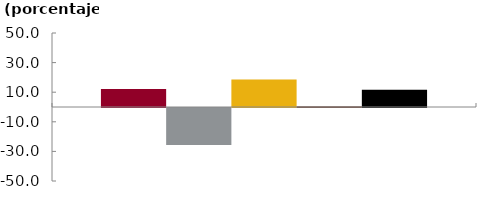
| Category | Bancos | CF | CFC | Coop | Sistema |
|---|---|---|---|---|---|
|  | 12.154 | -25.007 | 18.566 | 0.573 | 11.735 |